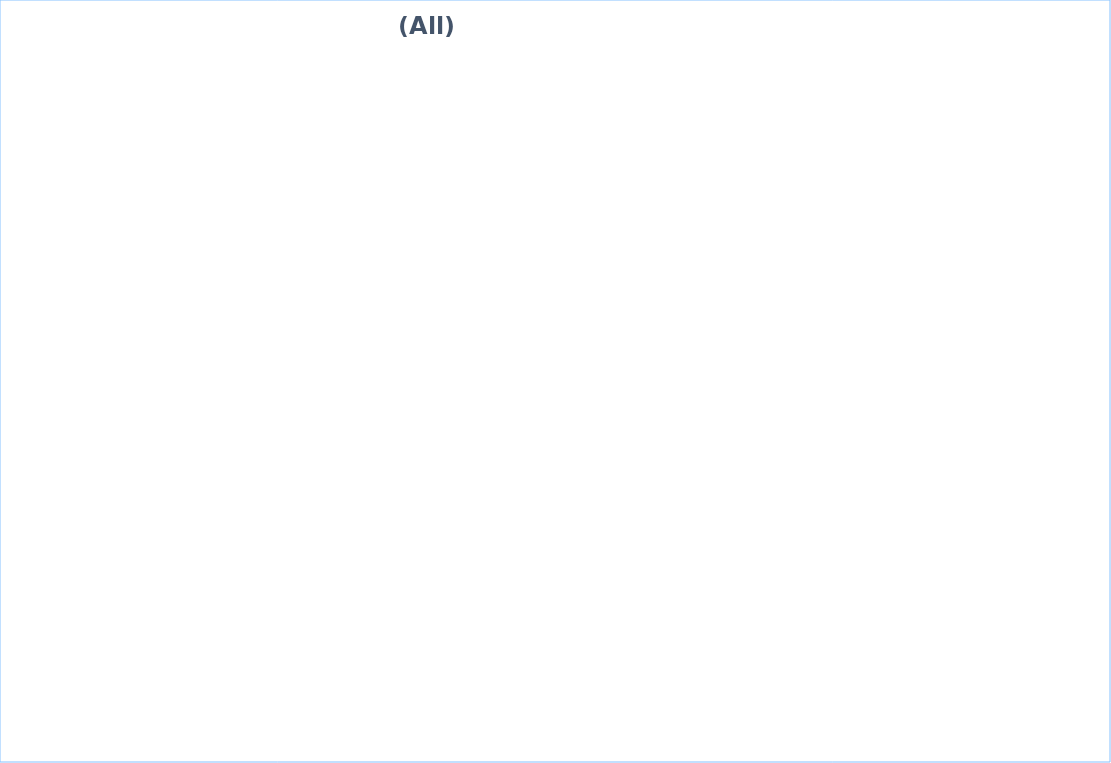
| Category | Total Population | Number of People adopt basic personal and community hygiene practices | Number of people with equitable and continuous access to safe sanitation facilities | Number of people with equitable and continuous access to sufficient quantity of domestic water |
|---|---|---|---|---|
| 0 | 1950 | 1950 | 1950 | 1950 |
| 1 | 1162 | 0 | 1162 | 581 |
| 2 | 5840 | 5840 | 5840 | 5840 |
| 3 | 45366 | 42561 | 34492 | 40547.493 |
| 4 | 184654 | 184438 | 143965 | 184540 |